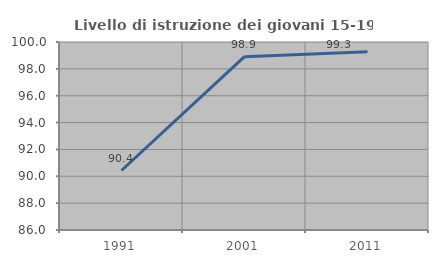
| Category | Livello di istruzione dei giovani 15-19 anni |
|---|---|
| 1991.0 | 90.43 |
| 2001.0 | 98.91 |
| 2011.0 | 99.268 |